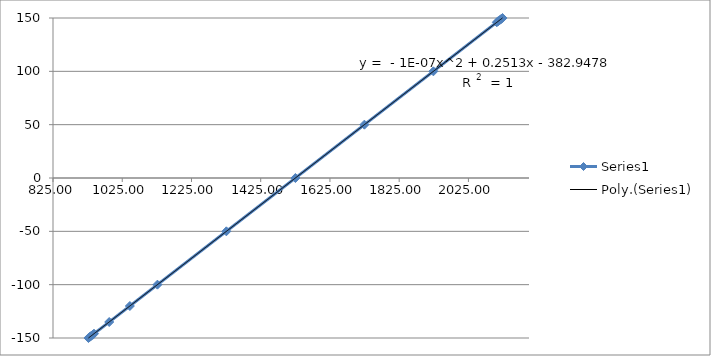
| Category | Series 0 |
|---|---|
| 2123.568 | 150 |
| 2119.404 | 149 |
| 2115.38 | 148 |
| 2111.068 | 147 |
| 2106.944 | 146 |
| 1923.78 | 100 |
| 1724.524 | 50 |
| 1525.232 | 0 |
| 1325.74 | -50 |
| 1126.632 | -100 |
| 1047.06 | -120 |
| 987.404 | -135 |
| 943.4 | -146 |
| 939.484 | -147 |
| 935.34 | -148 |
| 931.244 | -149 |
| 927.428 | -150 |